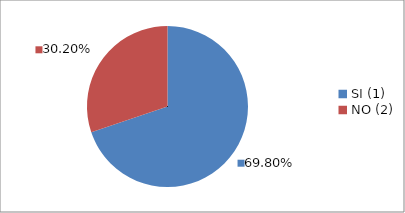
| Category | Series 0 |
|---|---|
| SI (1) | 0.698 |
| NO (2) | 0.302 |